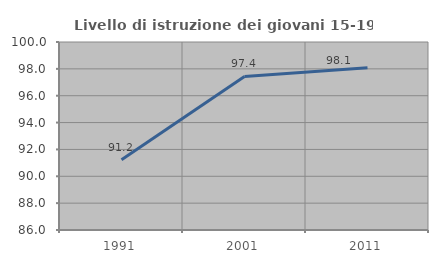
| Category | Livello di istruzione dei giovani 15-19 anni |
|---|---|
| 1991.0 | 91.224 |
| 2001.0 | 97.436 |
| 2011.0 | 98.085 |